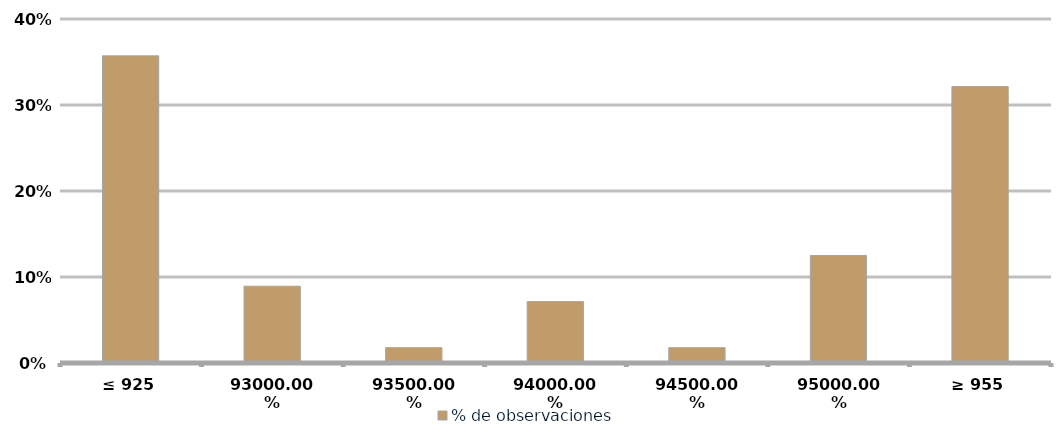
| Category | % de observaciones  |
|---|---|
| ≤ 925 | 0.357 |
| 930 | 0.089 |
| 935 | 0.018 |
| 940 | 0.071 |
| 945 | 0.018 |
| 950 | 0.125 |
| ≥ 955 | 0.321 |